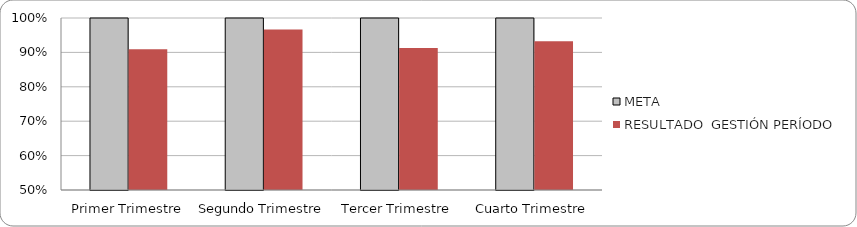
| Category | META | RESULTADO  GESTIÓN PERÍODO |
|---|---|---|
| Primer Trimestre | 1 | 0.909 |
| Segundo Trimestre | 1 | 0.967 |
| Tercer Trimestre | 1 | 0.913 |
| Cuarto Trimestre | 1 | 0.932 |